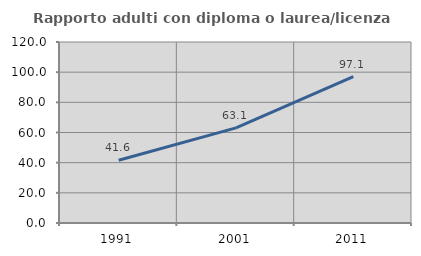
| Category | Rapporto adulti con diploma o laurea/licenza media  |
|---|---|
| 1991.0 | 41.584 |
| 2001.0 | 63.057 |
| 2011.0 | 97.067 |